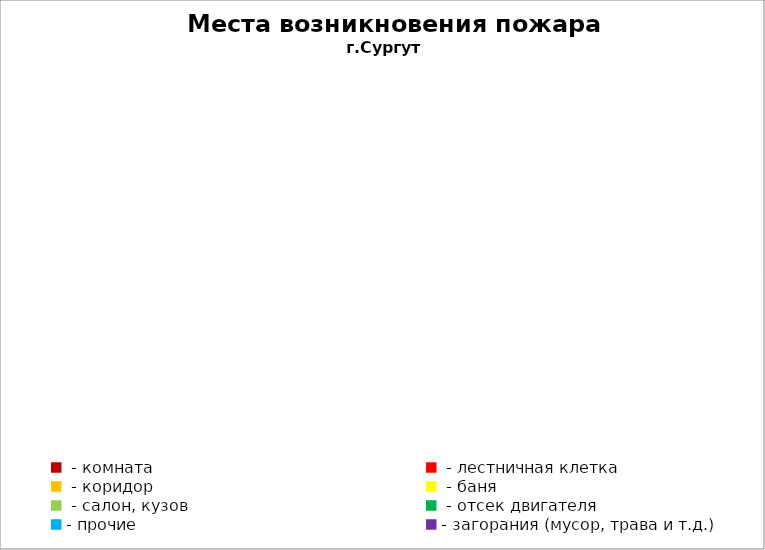
| Category | Места возникновения пожара |
|---|---|
|  - комната | 12 |
|  - лестничная клетка | 5 |
|  - коридор | 2 |
|  - баня | 5 |
|  - салон, кузов | 1 |
|  - отсек двигателя | 4 |
| - прочие | 10 |
| - загорания (мусор, трава и т.д.)  | 15 |